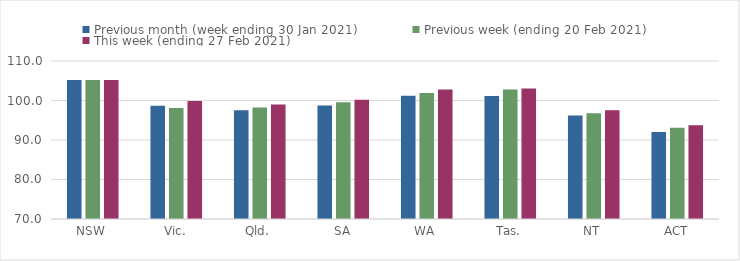
| Category | Previous month (week ending 30 Jan 2021) | Previous week (ending 20 Feb 2021) | This week (ending 27 Feb 2021) |
|---|---|---|---|
| NSW | 105.16 | 105.16 | 105.16 |
| Vic. | 98.64 | 98.09 | 99.87 |
| Qld. | 97.54 | 98.22 | 99.01 |
| SA | 98.74 | 99.54 | 100.21 |
| WA | 101.23 | 101.87 | 102.77 |
| Tas. | 101.16 | 102.76 | 103.05 |
| NT | 96.2 | 96.76 | 97.54 |
| ACT | 92.04 | 93.1 | 93.71 |